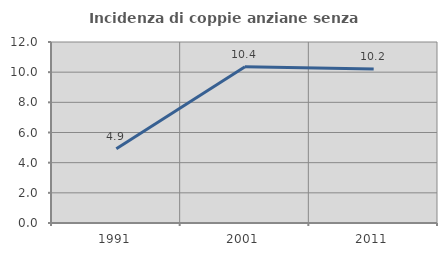
| Category | Incidenza di coppie anziane senza figli  |
|---|---|
| 1991.0 | 4.926 |
| 2001.0 | 10.363 |
| 2011.0 | 10.215 |